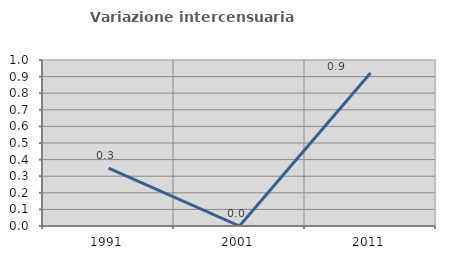
| Category | Variazione intercensuaria annua |
|---|---|
| 1991.0 | 0.349 |
| 2001.0 | 0 |
| 2011.0 | 0.921 |